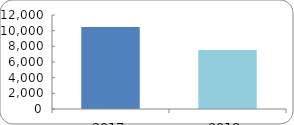
| Category | CERTIFICACIÓN DE COMPETENCIAS |
|---|---|
| 2017.0 | 10459 |
| 2018.0 | 7534 |